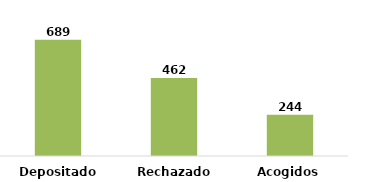
| Category | Series 0 |
|---|---|
| Depositados | 689 |
| Rechazados | 462 |
| Acogidos | 244 |